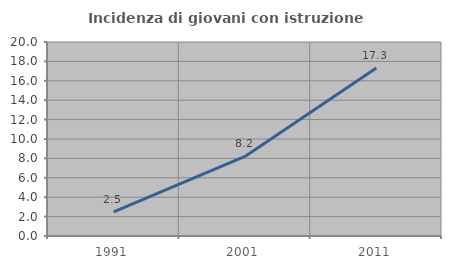
| Category | Incidenza di giovani con istruzione universitaria |
|---|---|
| 1991.0 | 2.491 |
| 2001.0 | 8.198 |
| 2011.0 | 17.308 |